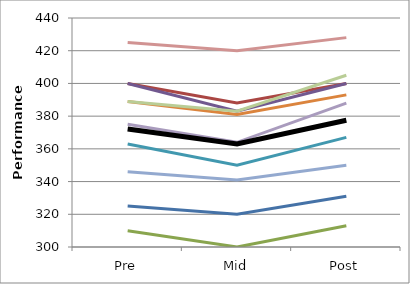
| Category | Series 0 | Series 1 | Series 2 | Series 3 | Series 4 | Series 5 | Series 6 | Series 7 | Series 8 | Series 9 | Mean |
|---|---|---|---|---|---|---|---|---|---|---|---|
| Pre | 325 | 400 | 310 | 400 | 363 | 389 | 346 | 425 | 389 | 375 | 372.2 |
| Mid | 320 | 388 | 300 | 383 | 350 | 381 | 341 | 420 | 383 | 364 | 363 |
| Post | 331 | 400 | 313 | 400 | 367 | 393 | 350 | 428 | 405 | 388 | 377.5 |